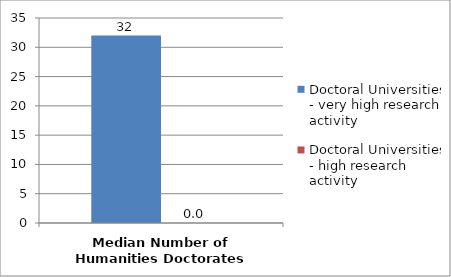
| Category | Doctoral Universities - very high research activity | Doctoral Universities - high research activity |
|---|---|---|
| 0 | 32 | 0 |